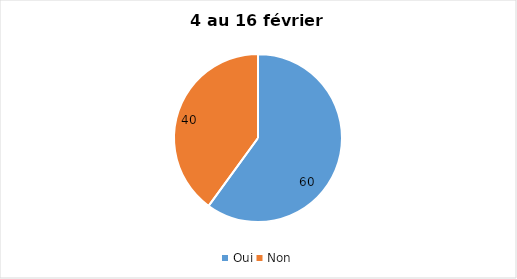
| Category | 4 au 16 février 2022 |
|---|---|
| Oui | 60 |
| Non | 40 |